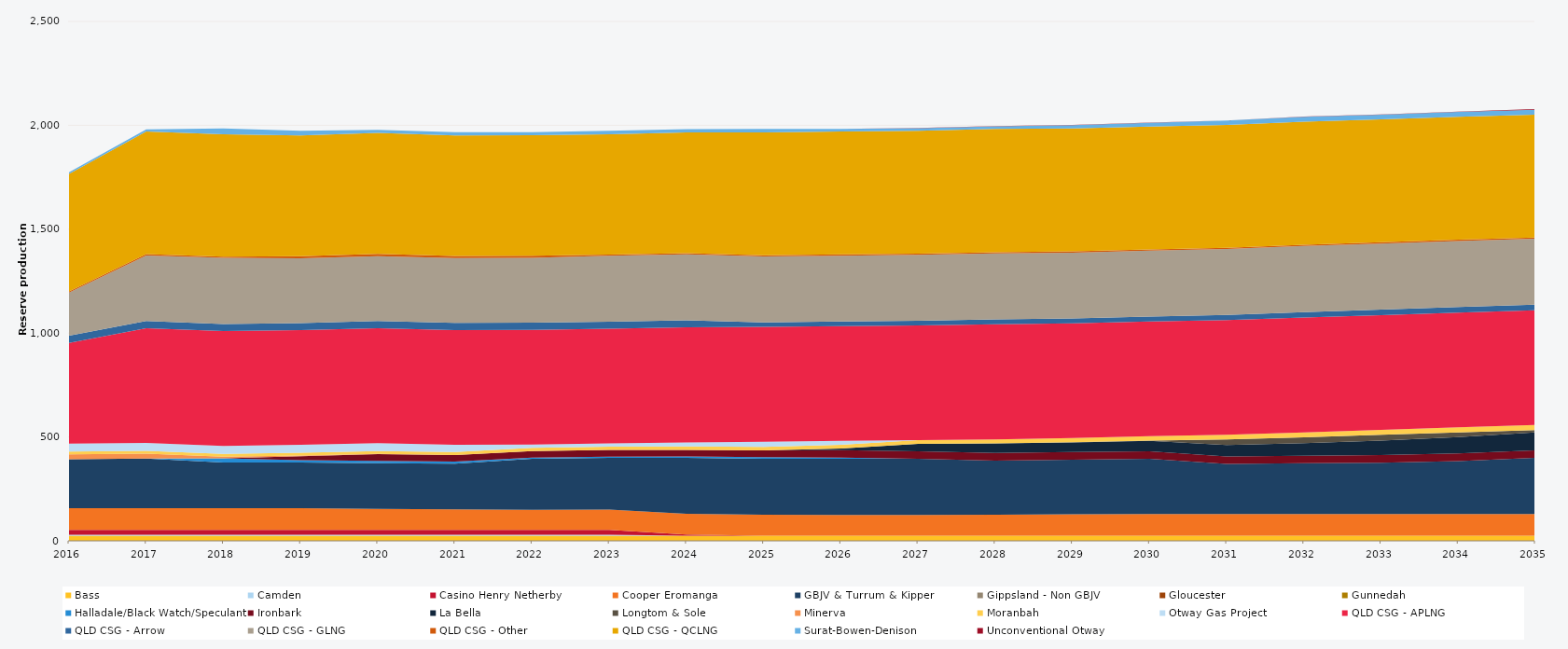
| Category | Bass | Camden | Casino Henry Netherby | Cooper Eromanga | GBJV & Turrum & Kipper | Gippsland - Non GBJV | Gloucester | Gunnedah | Halladale/Black Watch/Speculant | Ironbark | La Bella | Longtom & Sole | Minerva | Moranbah | Otway Gas Project | QLD CSG - APLNG | QLD CSG - Arrow | QLD CSG - GLNG | QLD CSG - Other | QLD CSG - QCLNG | Surat-Bowen-Denison | Unconventional Otway |
|---|---|---|---|---|---|---|---|---|---|---|---|---|---|---|---|---|---|---|---|---|---|---|
| 2016 | 24.522 | 5 | 23.12 | 105 | 235.041 | 0 | 0 | 0 | 0 | 0 | 0 | 0 | 23.79 | 13.077 | 38 | 485.346 | 34.038 | 207.727 | 5.856 | 565.864 | 7.808 | 0 |
| 2017 | 24.455 | 5 | 23.12 | 105 | 238.37 | 0 | 0 | 0 | 0 | 0 | 0 | 0 | 23.725 | 13.709 | 38 | 552.245 | 33.945 | 316.294 | 5.84 | 590.172 | 10.711 | 0 |
| 2018 | 24.455 | 5 | 23.12 | 105 | 220 | 0 | 0 | 0 | 19.574 | 0 | 0 | 0 | 7.822 | 14.121 | 38 | 552.245 | 33.945 | 318.577 | 5.84 | 589.235 | 28.064 | 0 |
| 2019 | 24.455 | 5 | 23.12 | 105 | 220 | 0 | 0 | 0 | 10.95 | 18.25 | 0 | 0 | 3.831 | 13.354 | 38 | 552.245 | 33.945 | 311.92 | 10.403 | 580.591 | 22.231 | 0 |
| 2020 | 24.522 | 5 | 23.12 | 101.556 | 220 | 0 | 0 | 0 | 10.95 | 31.776 | 0 | 0 | 1.582 | 13.322 | 38 | 553.758 | 34.038 | 312.747 | 10.419 | 582.406 | 14.776 | 0 |
| 2021 | 24.455 | 5 | 23.12 | 98.464 | 220 | 0 | 0 | 0 | 10.95 | 31.329 | 0 | 0 | 0 | 13.832 | 35.457 | 552.245 | 33.945 | 311.839 | 10.403 | 579.786 | 15.823 | 0 |
| 2022 | 24.455 | 5 | 23.12 | 96.855 | 245.927 | 0 | 0 | 0 | 4.828 | 32.125 | 0 | 0 | 0 | 15.305 | 16.114 | 552.245 | 33.945 | 311.905 | 10.403 | 579.646 | 15.538 | 0 |
| 2023 | 24.455 | 5 | 23.12 | 97.871 | 249.552 | 0 | 0 | 0 | 5.261 | 32.08 | 0 | 0 | 0 | 16.282 | 15.305 | 552.245 | 33.945 | 316.633 | 5.84 | 579.627 | 16.084 | 0 |
| 2024 | 24.522 | 0 | 5.3 | 99.942 | 270 | 0 | 0 | 0 | 6.386 | 31.818 | 0 | 0 | 0 | 16.806 | 18.94 | 553.758 | 34.038 | 317.367 | 5.856 | 580.633 | 16.459 | 0 |
| 2025 | 24.455 | 0 | 0 | 100.749 | 270 | 0 | 0 | 0 | 7.438 | 32.698 | 0 | 0 | 0 | 17.285 | 24.715 | 552.245 | 22.077 | 316.806 | 5.84 | 591.794 | 16.751 | 0 |
| 2026 | 24.455 | 0 | 0 | 100.482 | 270 | 0 | 0 | 0 | 5.662 | 35.334 | 8.363 | 0 | 0 | 17.534 | 19.075 | 552.245 | 22.876 | 316.704 | 5.84 | 591.753 | 11.928 | 0 |
| 2027 | 24.455 | 0 | 0 | 100.567 | 270 | 0 | 0 | 0 | 0 | 35.715 | 35.497 | 0 | 0 | 18.159 | 0 | 552.245 | 23.167 | 316.867 | 5.84 | 591.694 | 12.145 | 0.33 |
| 2028 | 24.522 | 0 | 0 | 100.767 | 261.09 | 0 | 0 | 0 | 0 | 36.6 | 46.349 | 0 | 0 | 19.008 | 0 | 553.758 | 23.513 | 317.838 | 5.856 | 593.235 | 13.041 | 1.044 |
| 2029 | 24.455 | 0 | 0 | 103.126 | 263.426 | 0 | 0 | 0 | 0 | 36.5 | 46.31 | 0.639 | 0 | 20.36 | 0 | 552.245 | 23.397 | 316.91 | 5.84 | 591.622 | 15.563 | 1.787 |
| 2030 | 24.455 | 0 | 0 | 105 | 265.134 | 0 | 0 | 0 | 0 | 36.5 | 50.448 | 0.73 | 0 | 21.622 | 0 | 552.245 | 23.644 | 317.293 | 5.84 | 591.579 | 17.913 | 1.035 |
| 2031 | 24.455 | 0 | 0 | 105 | 240.515 | 0 | 0 | 0 | 0 | 36.5 | 54.232 | 27.375 | 0 | 22.567 | 0 | 552.245 | 24.211 | 317.568 | 5.84 | 591.53 | 20.661 | 0.769 |
| 2032 | 24.522 | 0 | 0 | 105 | 243.786 | 0 | 0 | 0 | 0 | 36.6 | 60.389 | 27.45 | 0 | 23.484 | 0 | 553.758 | 25.31 | 318.7 | 5.856 | 593.07 | 23.685 | 0.521 |
| 2033 | 24.455 | 0 | 0 | 105 | 246.486 | 0 | 0 | 0 | 0 | 36.5 | 70.518 | 27.375 | 0 | 23.992 | 0 | 552.245 | 26.325 | 318.169 | 5.84 | 591.435 | 22.62 | 0.965 |
| 2034 | 24.455 | 0 | 0 | 105 | 254.774 | 0 | 0 | 0 | 0 | 36.5 | 78.076 | 22.914 | 0 | 24.563 | 0 | 552.245 | 26.511 | 318.356 | 5.84 | 591.394 | 23.718 | 1.875 |
| 2035 | 24.455 | 0 | 0 | 105 | 270 | 0 | 0 | 0 | 0 | 36.5 | 85.945 | 11.249 | 0 | 24.813 | 0 | 552.245 | 26.426 | 317.84 | 5.84 | 591.053 | 23.995 | 2.675 |